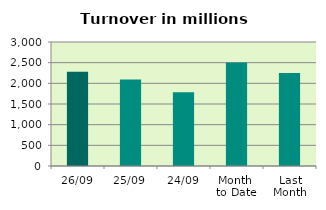
| Category | Series 0 |
|---|---|
| 26/09 | 2278.747 |
| 25/09 | 2091.641 |
| 24/09 | 1784.35 |
| Month 
to Date | 2506.31 |
| Last
Month | 2251.437 |